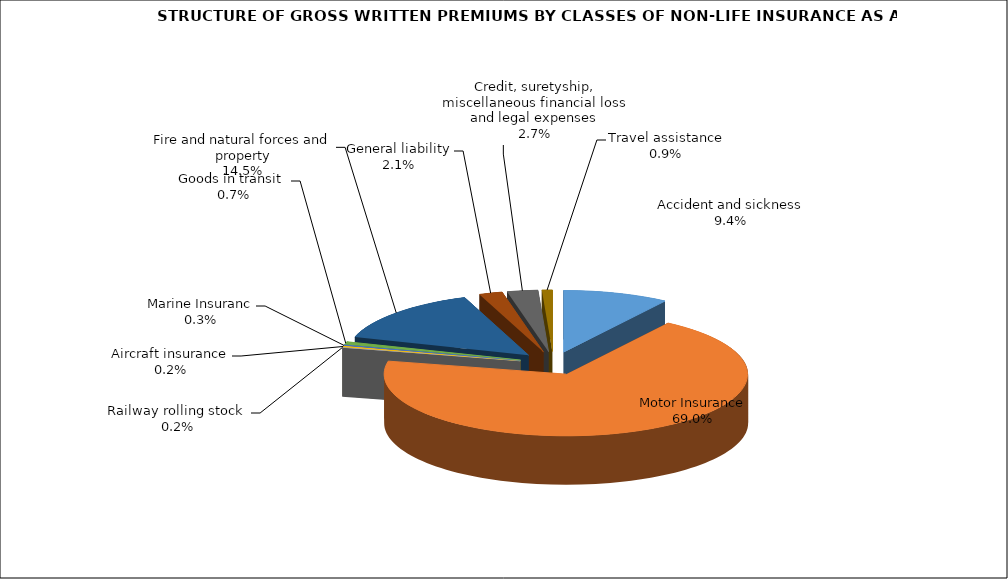
| Category | Accident and sickness | Series 1 |
|---|---|---|
| Accident and sickness | 0.094 |  |
| Motor Insurance | 0.69 |  |
| Railway rolling stock  | 0.002 |  |
| Aircraft insurance | 0.002 |  |
| Marine Insuranc | 0.003 |  |
| Goods in transit  | 0.007 |  |
| Fire and natural forces and property | 0.145 |  |
| General liability | 0.021 |  |
| Credit, suretyship, miscellaneous financial loss and legal expenses | 0.027 |  |
| Travel assistance | 0.009 |  |